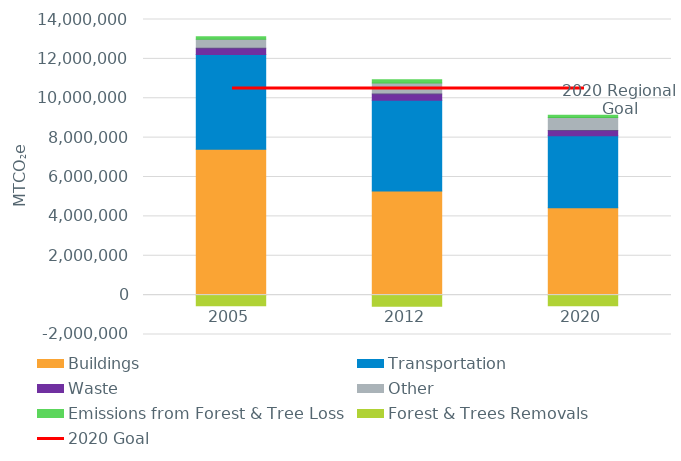
| Category | Buildings | Transportation  | Waste | Other  | Emissions from Forest & Tree Loss | Forest & Trees Removals |
|---|---|---|---|---|---|---|
| 2005.0 | 7414470.112 | 4801901.964 | 324762.9 | 453301.844 | 131574.282 | -545740.168 |
| 2012.0 | 5283887.587 | 4618956.599 | 310486.7 | 563604.81 | 164615.749 | -564204.071 |
| 2020.0 | 4439428.7 | 3653004.034 | 265641.83 | 663522.562 | 118135 | -538095 |